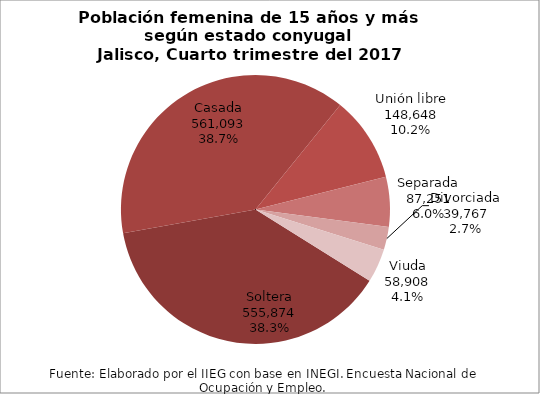
| Category | Series 0 |
|---|---|
| Soltera | 555874 |
| Casada | 561093 |
| Unión libre | 148648 |
| Separada | 87251 |
| Divorciada | 39767 |
| Viuda | 58908 |